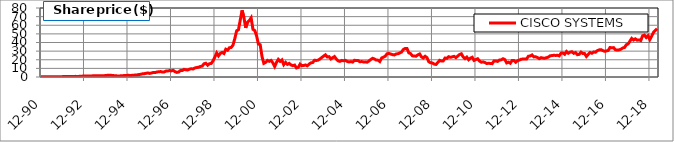
| Category | CISCO SYSTEMS |
|---|---|
| 1990-12-31 | 0.16 |
| 1991-01-31 | 0.203 |
| 1991-02-28 | 0.194 |
| 1991-03-29 | 0.169 |
| 1991-04-30 | 0.207 |
| 1991-05-31 | 0.224 |
| 1991-06-28 | 0.212 |
| 1991-07-31 | 0.273 |
| 1991-08-30 | 0.315 |
| 1991-09-30 | 0.285 |
| 1991-10-31 | 0.339 |
| 1991-11-29 | 0.344 |
| 1991-12-31 | 0.46 |
| 1992-01-31 | 0.522 |
| 1992-02-28 | 0.566 |
| 1992-03-31 | 0.549 |
| 1992-04-30 | 0.507 |
| 1992-05-29 | 0.635 |
| 1992-06-30 | 0.653 |
| 1992-07-31 | 0.741 |
| 1992-08-31 | 0.651 |
| 1992-09-30 | 0.734 |
| 1992-10-30 | 0.833 |
| 1992-11-30 | 1.038 |
| 1992-12-31 | 1.092 |
| 1993-01-29 | 1.229 |
| 1993-02-26 | 1.219 |
| 1993-03-31 | 1.243 |
| 1993-04-30 | 1.146 |
| 1993-05-31 | 1.5 |
| 1993-06-30 | 1.521 |
| 1993-07-30 | 1.441 |
| 1993-08-31 | 1.326 |
| 1993-09-30 | 1.389 |
| 1993-10-29 | 1.424 |
| 1993-11-30 | 1.563 |
| 1993-12-31 | 1.795 |
| 1994-01-31 | 2.014 |
| 1994-02-28 | 2.049 |
| 1994-03-31 | 1.903 |
| 1994-04-29 | 1.684 |
| 1994-05-31 | 1.375 |
| 1994-06-30 | 1.299 |
| 1994-07-29 | 1.167 |
| 1994-08-31 | 1.378 |
| 1994-09-30 | 1.521 |
| 1994-10-31 | 1.674 |
| 1994-11-30 | 1.792 |
| 1994-12-30 | 1.952 |
| 1995-01-31 | 1.854 |
| 1995-02-28 | 1.875 |
| 1995-03-31 | 2.118 |
| 1995-04-28 | 2.215 |
| 1995-05-31 | 2.431 |
| 1995-06-30 | 2.809 |
| 1995-07-31 | 3.097 |
| 1995-08-31 | 3.646 |
| 1995-09-29 | 3.834 |
| 1995-10-31 | 4.306 |
| 1995-11-30 | 4.674 |
| 1995-12-29 | 4.146 |
| 1996-01-31 | 4.625 |
| 1996-02-29 | 5.278 |
| 1996-03-29 | 5.153 |
| 1996-04-30 | 5.764 |
| 1996-05-31 | 6.084 |
| 1996-06-28 | 6.292 |
| 1996-07-31 | 5.75 |
| 1996-08-30 | 5.861 |
| 1996-09-30 | 6.896 |
| 1996-10-31 | 6.875 |
| 1996-11-29 | 7.542 |
| 1996-12-31 | 7.07 |
| 1997-01-31 | 7.75 |
| 1997-02-28 | 6.181 |
| 1997-03-31 | 5.348 |
| 1997-04-30 | 5.75 |
| 1997-05-30 | 7.528 |
| 1997-06-30 | 7.459 |
| 1997-07-31 | 8.841 |
| 1997-08-29 | 8.375 |
| 1997-09-30 | 8.119 |
| 1997-10-31 | 9.115 |
| 1997-11-28 | 9.584 |
| 1997-12-31 | 9.292 |
| 1998-01-30 | 10.51 |
| 1998-02-27 | 10.979 |
| 1998-03-31 | 11.396 |
| 1998-04-30 | 12.208 |
| 1998-05-29 | 12.604 |
| 1998-06-30 | 15.344 |
| 1998-07-31 | 15.958 |
| 1998-08-31 | 13.646 |
| 1998-09-30 | 15.453 |
| 1998-10-30 | 15.75 |
| 1998-11-30 | 18.844 |
| 1998-12-31 | 23.203 |
| 1999-01-29 | 27.891 |
| 1999-02-26 | 24.453 |
| 1999-03-31 | 27.391 |
| 1999-04-30 | 28.516 |
| 1999-05-31 | 27.25 |
| 1999-06-30 | 32.219 |
| 1999-07-30 | 31.062 |
| 1999-08-31 | 33.906 |
| 1999-09-30 | 34.281 |
| 1999-10-29 | 37 |
| 1999-11-30 | 44.594 |
| 1999-12-31 | 53.562 |
| 2000-01-31 | 54.75 |
| 2000-02-29 | 66.094 |
| 2000-03-31 | 77.312 |
| 2000-04-28 | 69.328 |
| 2000-05-31 | 56.938 |
| 2000-06-30 | 63.562 |
| 2000-07-31 | 65.438 |
| 2000-08-31 | 68.625 |
| 2000-09-29 | 55.25 |
| 2000-10-31 | 53.875 |
| 2000-11-30 | 47.875 |
| 2000-12-29 | 38.25 |
| 2001-01-31 | 37.438 |
| 2001-02-28 | 23.688 |
| 2001-03-30 | 15.812 |
| 2001-04-30 | 16.98 |
| 2001-05-31 | 19.26 |
| 2001-06-29 | 18.2 |
| 2001-07-31 | 19.22 |
| 2001-08-31 | 16.33 |
| 2001-09-28 | 12.18 |
| 2001-10-31 | 16.92 |
| 2001-11-30 | 20.44 |
| 2001-12-31 | 18.11 |
| 2002-01-31 | 19.8 |
| 2002-02-28 | 14.27 |
| 2002-03-29 | 16.93 |
| 2002-04-30 | 14.65 |
| 2002-05-31 | 15.78 |
| 2002-06-28 | 13.95 |
| 2002-07-31 | 13.19 |
| 2002-08-30 | 13.82 |
| 2002-09-30 | 10.48 |
| 2002-10-31 | 11.18 |
| 2002-11-29 | 14.92 |
| 2002-12-31 | 13.1 |
| 2003-01-31 | 13.37 |
| 2003-02-28 | 13.98 |
| 2003-03-31 | 12.98 |
| 2003-04-30 | 15 |
| 2003-05-30 | 16.41 |
| 2003-06-30 | 16.79 |
| 2003-07-31 | 19.49 |
| 2003-08-29 | 19.14 |
| 2003-09-30 | 19.59 |
| 2003-10-31 | 20.93 |
| 2003-11-28 | 22.7 |
| 2003-12-31 | 24.23 |
| 2004-01-30 | 25.71 |
| 2004-02-27 | 23.16 |
| 2004-03-31 | 23.57 |
| 2004-04-30 | 20.91 |
| 2004-05-31 | 22.37 |
| 2004-06-30 | 23.7 |
| 2004-07-30 | 20.92 |
| 2004-08-31 | 18.76 |
| 2004-09-30 | 18.1 |
| 2004-10-29 | 19.21 |
| 2004-11-30 | 18.75 |
| 2004-12-31 | 19.32 |
| 2005-01-31 | 18.04 |
| 2005-02-28 | 17.42 |
| 2005-03-31 | 17.89 |
| 2005-04-29 | 17.27 |
| 2005-05-31 | 19.4 |
| 2005-06-30 | 19.08 |
| 2005-07-29 | 19.15 |
| 2005-08-31 | 17.62 |
| 2005-09-30 | 17.92 |
| 2005-10-31 | 17.45 |
| 2005-11-30 | 17.54 |
| 2005-12-30 | 17.12 |
| 2006-01-31 | 18.57 |
| 2006-02-28 | 20.24 |
| 2006-03-31 | 21.67 |
| 2006-04-28 | 20.95 |
| 2006-05-31 | 19.68 |
| 2006-06-30 | 19.53 |
| 2006-07-31 | 17.88 |
| 2006-08-31 | 21.99 |
| 2006-09-29 | 22.98 |
| 2006-10-31 | 24.13 |
| 2006-11-30 | 26.91 |
| 2006-12-29 | 27.33 |
| 2007-01-31 | 26.62 |
| 2007-02-28 | 25.94 |
| 2007-03-30 | 25.53 |
| 2007-04-30 | 26.74 |
| 2007-05-31 | 26.92 |
| 2007-06-29 | 27.85 |
| 2007-07-31 | 28.91 |
| 2007-08-31 | 31.92 |
| 2007-09-28 | 33.13 |
| 2007-10-31 | 33.06 |
| 2007-11-30 | 28.02 |
| 2007-12-31 | 27.07 |
| 2008-01-31 | 24.5 |
| 2008-02-29 | 24.39 |
| 2008-03-31 | 24.09 |
| 2008-04-30 | 25.64 |
| 2008-05-30 | 26.72 |
| 2008-06-30 | 23.26 |
| 2008-07-31 | 21.99 |
| 2008-08-29 | 24.05 |
| 2008-09-30 | 22.56 |
| 2008-10-31 | 17.77 |
| 2008-11-28 | 16.54 |
| 2008-12-31 | 16.3 |
| 2009-01-30 | 14.97 |
| 2009-02-27 | 14.57 |
| 2009-03-31 | 16.77 |
| 2009-04-30 | 19.32 |
| 2009-05-29 | 18.5 |
| 2009-06-30 | 18.65 |
| 2009-07-31 | 22.01 |
| 2009-08-31 | 21.6 |
| 2009-09-30 | 23.54 |
| 2009-10-30 | 22.81 |
| 2009-11-30 | 23.4 |
| 2009-12-31 | 23.94 |
| 2010-01-29 | 22.47 |
| 2010-02-26 | 24.33 |
| 2010-03-31 | 26.03 |
| 2010-04-30 | 26.93 |
| 2010-05-31 | 23.16 |
| 2010-06-30 | 21.31 |
| 2010-07-30 | 23.07 |
| 2010-08-31 | 19.985 |
| 2010-09-30 | 21.9 |
| 2010-10-29 | 22.86 |
| 2010-11-30 | 19.16 |
| 2010-12-31 | 20.23 |
| 2011-01-31 | 21.15 |
| 2011-02-28 | 18.56 |
| 2011-03-31 | 17.15 |
| 2011-04-29 | 17.52 |
| 2011-05-31 | 16.8 |
| 2011-06-30 | 15.61 |
| 2011-07-29 | 15.97 |
| 2011-08-31 | 15.67 |
| 2011-09-30 | 15.5 |
| 2011-10-31 | 18.53 |
| 2011-11-30 | 18.64 |
| 2011-12-30 | 18.08 |
| 2012-01-31 | 19.645 |
| 2012-02-29 | 19.88 |
| 2012-03-30 | 21.15 |
| 2012-04-30 | 20.155 |
| 2012-05-31 | 16.33 |
| 2012-06-29 | 17.17 |
| 2012-07-31 | 15.95 |
| 2012-08-31 | 19.08 |
| 2012-09-28 | 19.095 |
| 2012-10-31 | 17.145 |
| 2012-11-30 | 18.91 |
| 2012-12-31 | 19.649 |
| 2013-01-31 | 20.57 |
| 2013-02-28 | 20.855 |
| 2013-03-29 | 20.895 |
| 2013-04-30 | 20.92 |
| 2013-05-31 | 24.115 |
| 2013-06-28 | 24.335 |
| 2013-07-31 | 25.59 |
| 2013-08-30 | 23.31 |
| 2013-09-30 | 23.431 |
| 2013-10-31 | 22.56 |
| 2013-11-30 | 21.25 |
| 2013-12-31 | 22.43 |
| 2014-01-31 | 21.91 |
| 2014-02-28 | 21.8 |
| 2014-03-31 | 22.415 |
| 2014-04-30 | 23.11 |
| 2014-05-31 | 24.62 |
| 2014-06-30 | 24.85 |
| 2014-07-31 | 25.23 |
| 2014-08-31 | 24.99 |
| 2014-09-30 | 25.17 |
| 2014-10-31 | 24.47 |
| 2014-11-30 | 27.64 |
| 2014-12-31 | 27.815 |
| 2015-01-30 | 26.365 |
| 2015-02-27 | 29.51 |
| 2015-03-31 | 27.525 |
| 2015-04-30 | 28.83 |
| 2015-05-29 | 29.31 |
| 2015-06-30 | 27.46 |
| 2015-07-31 | 28.42 |
| 2015-08-31 | 25.88 |
| 2015-09-30 | 26.25 |
| 2015-10-30 | 28.85 |
| 2015-11-30 | 27.25 |
| 2015-12-31 | 27.155 |
| 2016-01-29 | 23.79 |
| 2016-02-29 | 26.18 |
| 2016-03-31 | 28.47 |
| 2016-04-29 | 27.49 |
| 2016-05-31 | 29.05 |
| 2016-06-30 | 28.69 |
| 2016-07-29 | 30.53 |
| 2016-08-31 | 31.44 |
| 2016-09-30 | 31.72 |
| 2016-10-31 | 30.68 |
| 2016-11-30 | 29.82 |
| 2016-12-30 | 30.22 |
| 2017-01-31 | 30.72 |
| 2017-02-28 | 34.18 |
| 2017-03-31 | 33.8 |
| 2017-04-28 | 34.07 |
| 2017-05-31 | 31.53 |
| 2017-06-30 | 31.3 |
| 2017-07-31 | 31.45 |
| 2017-08-31 | 32.21 |
| 2017-09-29 | 33.63 |
| 2017-10-31 | 34.15 |
| 2017-11-30 | 37.3 |
| 2017-12-29 | 38.3 |
| 2018-01-31 | 41.54 |
| 2018-02-28 | 44.78 |
| 2018-03-30 | 42.89 |
| 2018-04-30 | 44.29 |
| 2018-05-31 | 42.71 |
| 2018-06-29 | 43.03 |
| 2018-07-31 | 42.29 |
| 2018-08-31 | 47.77 |
| 2018-09-28 | 48.65 |
| 2018-10-31 | 45.75 |
| 2018-11-30 | 47.87 |
| 2018-12-31 | 43.33 |
| 2019-01-31 | 47.29 |
| 2019-02-28 | 51.77 |
| 2019-03-29 | 53.99 |
| 2019-04-30 | 55.95 |